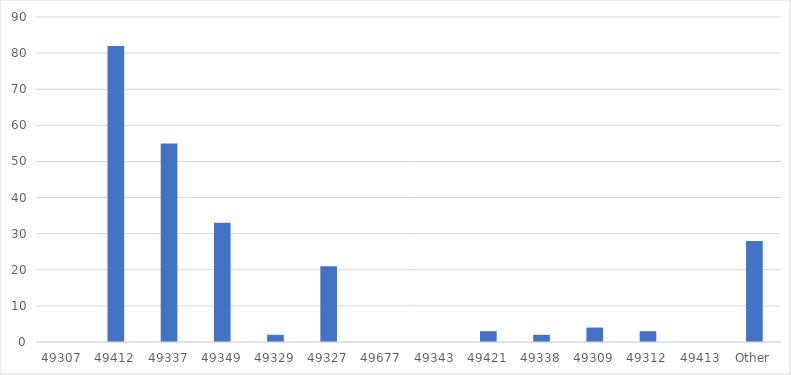
| Category | Number of Responses |
|---|---|
| 49307 | 0 |
| 49412 | 82 |
| 49337 | 55 |
| 49349 | 33 |
| 49329 | 2 |
| 49327 | 21 |
| 49677 | 0 |
| 49343 | 0 |
| 49421 | 3 |
| 49338 | 2 |
| 49309 | 4 |
| 49312 | 3 |
| 49413 | 0 |
| Other | 28 |